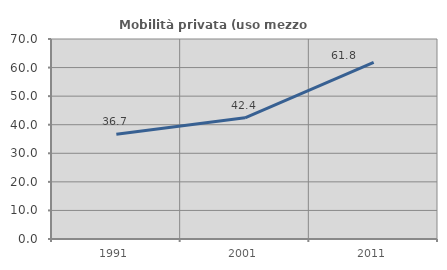
| Category | Mobilità privata (uso mezzo privato) |
|---|---|
| 1991.0 | 36.658 |
| 2001.0 | 42.408 |
| 2011.0 | 61.804 |